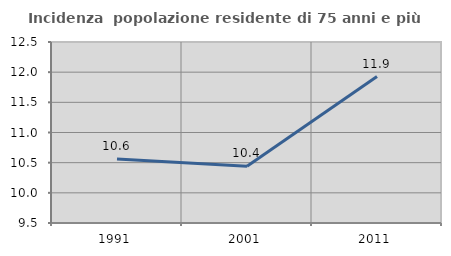
| Category | Incidenza  popolazione residente di 75 anni e più |
|---|---|
| 1991.0 | 10.562 |
| 2001.0 | 10.44 |
| 2011.0 | 11.927 |